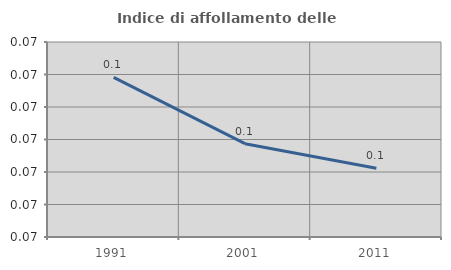
| Category | Indice di affollamento delle abitazioni  |
|---|---|
| 1991.0 | 0.072 |
| 2001.0 | 0.071 |
| 2011.0 | 0.071 |